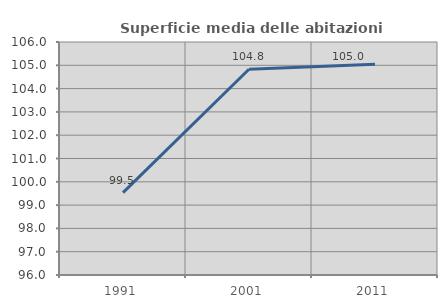
| Category | Superficie media delle abitazioni occupate |
|---|---|
| 1991.0 | 99.536 |
| 2001.0 | 104.829 |
| 2011.0 | 105.049 |